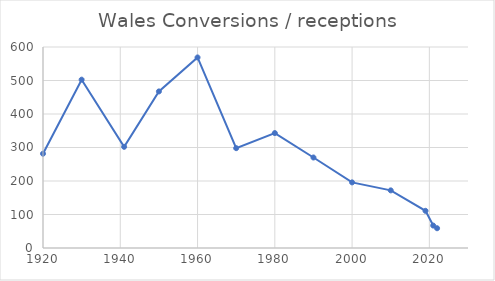
| Category | Wales |
|---|---|
| 1920.0 | 281.48 |
| 1930.0 | 502.49 |
| 1941.0 | 302.01 |
| 1950.0 | 467.36 |
| 1960.0 | 568.81 |
| 1970.0 | 298.03 |
| 1980.0 | 343.07 |
| 1990.0 | 270.15 |
| 2000.0 | 195.89 |
| 2010.0 | 172 |
| 2019.0 | 111 |
| 2021.0 | 67 |
| 2022.0 | 59 |